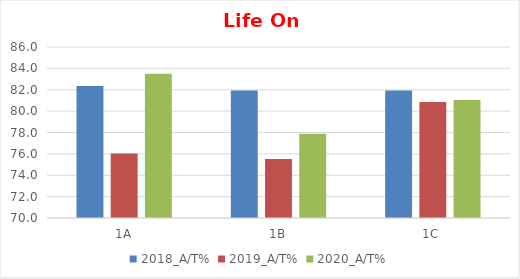
| Category | 2018_A/T% | 2019_A/T% | 2020_A/T% |
|---|---|---|---|
| 1A | 82.353 | 76.042 | 83.505 |
| 1B | 81.928 | 75.532 | 77.895 |
| 1C | 81.928 | 80.851 | 81.053 |